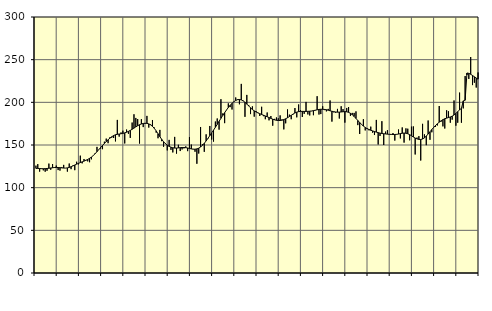
| Category | Piggar | Series 1 |
|---|---|---|
| nan | 125.8 | 122.56 |
| 1.0 | 127.6 | 122.56 |
| 1.0 | 118.8 | 122.42 |
| 1.0 | 121.9 | 122.25 |
| 1.0 | 120.3 | 122.22 |
| 1.0 | 118.7 | 122.3 |
| 1.0 | 119.8 | 122.47 |
| 1.0 | 128.2 | 122.77 |
| 1.0 | 121 | 123.06 |
| 1.0 | 127.7 | 123.35 |
| 1.0 | 124.1 | 123.57 |
| 1.0 | 125.9 | 123.68 |
| nan | 120.6 | 123.64 |
| 2.0 | 120 | 123.44 |
| 2.0 | 124.1 | 123.18 |
| 2.0 | 126.7 | 122.98 |
| 2.0 | 122.9 | 122.95 |
| 2.0 | 118.8 | 123.18 |
| 2.0 | 128.3 | 123.71 |
| 2.0 | 121.7 | 124.52 |
| 2.0 | 126 | 125.49 |
| 2.0 | 120.5 | 126.54 |
| 2.0 | 130.4 | 127.56 |
| 2.0 | 127.3 | 128.5 |
| nan | 137.5 | 129.38 |
| 3.0 | 128.5 | 130.25 |
| 3.0 | 133.6 | 131.14 |
| 3.0 | 132.5 | 132.06 |
| 3.0 | 130.8 | 133.1 |
| 3.0 | 129.8 | 134.35 |
| 3.0 | 133.2 | 135.86 |
| 3.0 | 137.5 | 137.66 |
| 3.0 | 140.5 | 139.8 |
| 3.0 | 147.8 | 142.14 |
| 3.0 | 144.9 | 144.6 |
| 3.0 | 145.8 | 147.07 |
| nan | 145.1 | 149.46 |
| 4.0 | 153.9 | 151.79 |
| 4.0 | 157.5 | 154.02 |
| 4.0 | 152.1 | 156.1 |
| 4.0 | 159.1 | 158.03 |
| 4.0 | 158.6 | 159.7 |
| 4.0 | 158.2 | 161.06 |
| 4.0 | 154.2 | 162 |
| 4.0 | 179.4 | 162.54 |
| 4.0 | 159.8 | 162.89 |
| 4.0 | 164.7 | 163.19 |
| 4.0 | 166.8 | 163.6 |
| nan | 151.8 | 164.21 |
| 5.0 | 168.1 | 164.99 |
| 5.0 | 163.1 | 165.95 |
| 5.0 | 158.3 | 167.12 |
| 5.0 | 176.3 | 168.43 |
| 5.0 | 186 | 169.81 |
| 5.0 | 181.7 | 171.21 |
| 5.0 | 180.4 | 172.59 |
| 5.0 | 151.7 | 173.77 |
| 5.0 | 180.3 | 174.64 |
| 5.0 | 171 | 175.23 |
| 5.0 | 174.9 | 175.48 |
| nan | 184.1 | 175.35 |
| 6.0 | 170.4 | 174.75 |
| 6.0 | 174.2 | 173.58 |
| 6.0 | 179.3 | 171.84 |
| 6.0 | 170.5 | 169.48 |
| 6.0 | 164.5 | 166.54 |
| 6.0 | 157.9 | 163.23 |
| 6.0 | 167.7 | 159.81 |
| 6.0 | 154.5 | 156.61 |
| 6.0 | 147.9 | 153.85 |
| 6.0 | 152.1 | 151.54 |
| 6.0 | 143.7 | 149.77 |
| nan | 156 | 148.41 |
| 7.0 | 144.3 | 147.41 |
| 7.0 | 141.3 | 146.77 |
| 7.0 | 159.5 | 146.42 |
| 7.0 | 139.9 | 146.39 |
| 7.0 | 150.3 | 146.63 |
| 7.0 | 142.9 | 146.92 |
| 7.0 | 144.8 | 147.08 |
| 7.0 | 146 | 147.07 |
| 7.0 | 148.4 | 146.86 |
| 7.0 | 142.8 | 146.49 |
| 7.0 | 159.2 | 145.96 |
| nan | 150.5 | 145.42 |
| 8.0 | 145.4 | 145.08 |
| 8.0 | 142.1 | 145.09 |
| 8.0 | 128 | 145.45 |
| 8.0 | 140 | 146.28 |
| 8.0 | 171.1 | 147.67 |
| 8.0 | 151 | 149.58 |
| 8.0 | 142 | 151.97 |
| 8.0 | 162.5 | 154.76 |
| 8.0 | 157.3 | 157.79 |
| 8.0 | 172.3 | 160.94 |
| 8.0 | 156.4 | 164.17 |
| nan | 154 | 167.43 |
| 9.0 | 177.5 | 170.73 |
| 9.0 | 181.1 | 174.14 |
| 9.0 | 168 | 177.69 |
| 9.0 | 203.7 | 181.24 |
| 9.0 | 187 | 184.62 |
| 9.0 | 175.6 | 187.88 |
| 9.0 | 190.9 | 191.01 |
| 9.0 | 198.8 | 193.94 |
| 9.0 | 194.4 | 196.57 |
| 9.0 | 191.6 | 198.85 |
| 9.0 | 200.5 | 200.74 |
| nan | 205.7 | 202.22 |
| 10.0 | 203.6 | 203.13 |
| 10.0 | 197.7 | 203.35 |
| 10.0 | 221.6 | 202.85 |
| 10.0 | 202.1 | 201.72 |
| 10.0 | 183 | 200.04 |
| 10.0 | 208.7 | 197.99 |
| 10.0 | 196.9 | 195.77 |
| 10.0 | 186.2 | 193.58 |
| 10.0 | 195.3 | 191.62 |
| 10.0 | 183.2 | 190 |
| 10.0 | 189.7 | 188.7 |
| nan | 188 | 187.63 |
| 11.0 | 184 | 186.68 |
| 11.0 | 194.8 | 185.77 |
| 11.0 | 183.8 | 184.88 |
| 11.0 | 180.2 | 183.99 |
| 11.0 | 188.1 | 183.09 |
| 11.0 | 178.9 | 182.16 |
| 11.0 | 184 | 181.17 |
| 11.0 | 172.6 | 180.26 |
| 11.0 | 180.6 | 179.48 |
| 11.0 | 182.3 | 178.94 |
| 11.0 | 181.3 | 178.68 |
| nan | 184.7 | 178.69 |
| 12.0 | 180 | 179.06 |
| 12.0 | 168.3 | 179.78 |
| 12.0 | 175.4 | 180.75 |
| 12.0 | 191.7 | 181.96 |
| 12.0 | 185.6 | 183.34 |
| 12.0 | 180.2 | 184.79 |
| 12.0 | 185.8 | 186.24 |
| 12.0 | 193.3 | 187.54 |
| 12.0 | 182.4 | 188.52 |
| 12.0 | 197.5 | 189.11 |
| 12.0 | 190.7 | 189.38 |
| nan | 182.8 | 189.41 |
| 13.0 | 186.5 | 189.36 |
| 13.0 | 200.5 | 189.35 |
| 13.0 | 185.8 | 189.46 |
| 13.0 | 184.6 | 189.61 |
| 13.0 | 189.7 | 189.85 |
| 13.0 | 184.9 | 190.25 |
| 13.0 | 190.4 | 190.76 |
| 13.0 | 207.2 | 191.26 |
| 13.0 | 185.7 | 191.67 |
| 13.0 | 186.2 | 191.91 |
| 13.0 | 195.4 | 191.87 |
| nan | 190.9 | 191.67 |
| 14.0 | 189.4 | 191.31 |
| 14.0 | 192.3 | 190.75 |
| 14.0 | 202.2 | 190.1 |
| 14.0 | 177.4 | 189.5 |
| 14.0 | 188.3 | 189.03 |
| 14.0 | 187.9 | 188.68 |
| 14.0 | 192.3 | 188.5 |
| 14.0 | 181 | 188.54 |
| 14.0 | 195.4 | 188.73 |
| 14.0 | 192.1 | 188.98 |
| 14.0 | 176.2 | 189.1 |
| nan | 193.4 | 188.9 |
| 15.0 | 194.5 | 188.28 |
| 15.0 | 184.1 | 187.14 |
| 15.0 | 187.6 | 185.48 |
| 15.0 | 187.6 | 183.43 |
| 15.0 | 189.4 | 181.12 |
| 15.0 | 173.3 | 178.7 |
| 15.0 | 162.9 | 176.36 |
| 15.0 | 173.9 | 174.13 |
| 15.0 | 180.2 | 172.19 |
| 15.0 | 167.1 | 170.56 |
| 15.0 | 169.8 | 169.24 |
| nan | 167.2 | 168.19 |
| 16.0 | 171.5 | 167.29 |
| 16.0 | 164.4 | 166.48 |
| 16.0 | 161.7 | 165.77 |
| 16.0 | 179.4 | 165.11 |
| 16.0 | 150.6 | 164.47 |
| 16.0 | 160.6 | 163.92 |
| 16.0 | 177.9 | 163.49 |
| 16.0 | 150 | 163.21 |
| 16.0 | 165.7 | 162.96 |
| 16.0 | 167.4 | 162.71 |
| 16.0 | 162.8 | 162.54 |
| nan | 162.4 | 162.4 |
| 17.0 | 164 | 162.27 |
| 17.0 | 155.2 | 162.29 |
| 17.0 | 162.2 | 162.51 |
| 17.0 | 168.2 | 162.85 |
| 17.0 | 157.7 | 163.33 |
| 17.0 | 170.6 | 163.8 |
| 17.0 | 152.8 | 163.98 |
| 17.0 | 169.5 | 163.79 |
| 17.0 | 169.1 | 163.18 |
| 17.0 | 155.5 | 162.15 |
| 17.0 | 171.5 | 160.83 |
| nan | 171.8 | 159.41 |
| 18.0 | 138.9 | 158.11 |
| 18.0 | 158.7 | 157.13 |
| 18.0 | 160.4 | 156.54 |
| 18.0 | 131.8 | 156.46 |
| 18.0 | 174.8 | 157.05 |
| 18.0 | 162.5 | 158.42 |
| 18.0 | 149.8 | 160.42 |
| 18.0 | 178.7 | 162.86 |
| 18.0 | 156.1 | 165.49 |
| 18.0 | 164.9 | 168.16 |
| 18.0 | 170.9 | 170.65 |
| nan | 171.1 | 172.87 |
| 19.0 | 172.9 | 174.92 |
| 19.0 | 195.7 | 176.75 |
| 19.0 | 177.3 | 178.31 |
| 19.0 | 171.8 | 179.7 |
| 19.0 | 169.3 | 180.78 |
| 19.0 | 190.7 | 181.51 |
| 19.0 | 189.5 | 182.17 |
| 19.0 | 176.1 | 182.87 |
| 19.0 | 179.7 | 183.79 |
| 19.0 | 202.2 | 185.17 |
| 19.0 | 172.6 | 187.01 |
| nan | 176.1 | 189.08 |
| 20.0 | 211.4 | 191.15 |
| 20.0 | 176.1 | 192.95 |
| 20.0 | 192.9 | 201.7 |
| 20.0 | 230.8 | 202.48 |
| 20.0 | 232 | 234.38 |
| 20.0 | 227.4 | 233.94 |
| 20.0 | 253.1 | 232.88 |
| 20.0 | 220.2 | 231.47 |
| 20.0 | 223 | 229.94 |
| 20.0 | 217.3 | 228.43 |
| 20.0 | 235 | 227.15 |